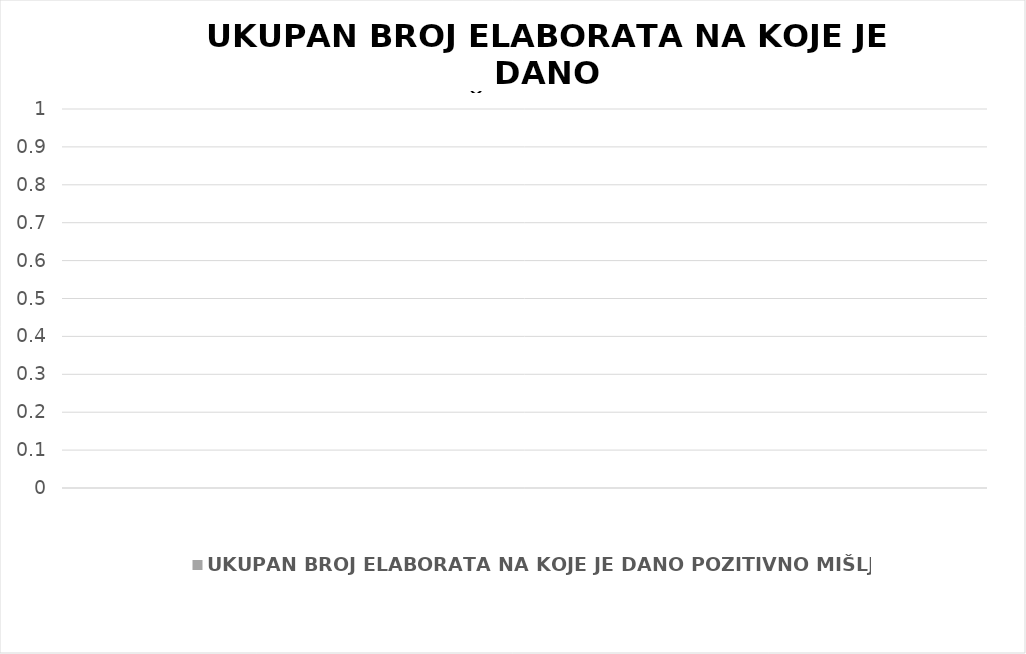
| Category | UKUPAN BROJ ELABORATA NA KOJE JE DANO POZITIVNO MIŠLJENJE |
|---|---|
|  | 0 |
|  | 0 |
|  | 0 |